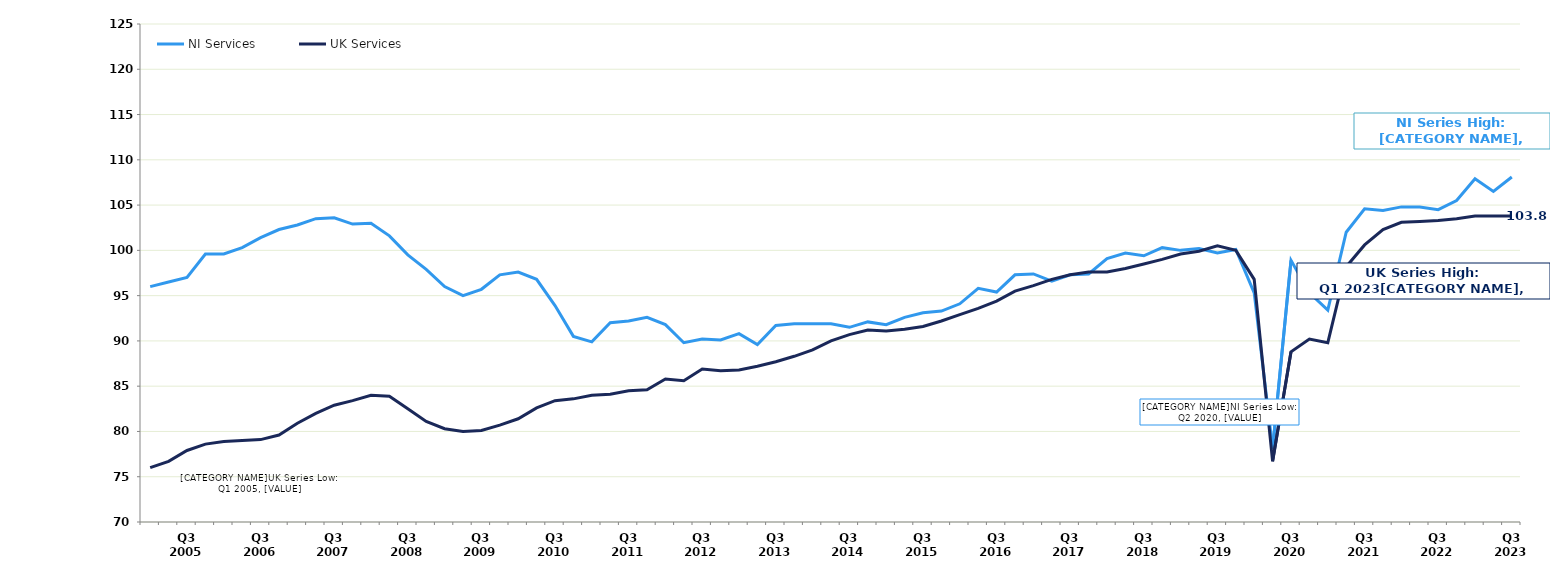
| Category | NI Services | UK Services |
|---|---|---|
|  | 96 | 76 |
|  | 96.5 | 76.7 |
| Q3 2005 | 97 | 77.9 |
|  | 99.6 | 78.6 |
|  | 99.6 | 78.9 |
|  | 100.3 | 79 |
| Q3 2006 | 101.4 | 79.1 |
|  | 102.3 | 79.6 |
|  | 102.8 | 80.9 |
|  | 103.5 | 82 |
| Q3 2007 | 103.6 | 82.9 |
|  | 102.9 | 83.4 |
|  | 103 | 84 |
|  | 101.6 | 83.9 |
| Q3 2008 | 99.5 | 82.5 |
|  | 97.9 | 81.1 |
|  | 96 | 80.3 |
|  | 95 | 80 |
| Q3 2009 | 95.7 | 80.1 |
|  | 97.3 | 80.7 |
|  | 97.6 | 81.4 |
|  | 96.8 | 82.6 |
| Q3 2010 | 93.9 | 83.4 |
|  | 90.5 | 83.6 |
|  | 89.9 | 84 |
|  | 92 | 84.1 |
| Q3 2011 | 92.2 | 84.5 |
|  | 92.6 | 84.6 |
|  | 91.8 | 85.8 |
|  | 89.8 | 85.6 |
| Q3 2012 | 90.2 | 86.9 |
|  | 90.1 | 86.7 |
|  | 90.8 | 86.8 |
|  | 89.6 | 87.2 |
| Q3 2013 | 91.7 | 87.7 |
|  | 91.9 | 88.3 |
|  | 91.9 | 89 |
|  | 91.9 | 90 |
| Q3 2014 | 91.5 | 90.7 |
|  | 92.1 | 91.2 |
|  | 91.8 | 91.1 |
|  | 92.6 | 91.3 |
| Q3 2015 | 93.1 | 91.6 |
|  | 93.3 | 92.2 |
|  | 94.1 | 92.9 |
|  | 95.8 | 93.6 |
| Q3 2016 | 95.4 | 94.4 |
|  | 97.3 | 95.5 |
|  | 97.4 | 96.1 |
|  | 96.6 | 96.8 |
| Q3 2017 | 97.3 | 97.3 |
|  | 97.4 | 97.6 |
|  | 99.1 | 97.6 |
|  | 99.7 | 98 |
| Q3 2018 | 99.4 | 98.5 |
|  | 100.3 | 99 |
|  | 100 | 99.6 |
|  | 100.2 | 99.9 |
| Q3 2019 | 99.7 | 100.5 |
|  | 100.1 | 100 |
|  | 95.3 | 96.8 |
|  | 78.1 | 76.7 |
| Q3 2020 | 98.9 | 88.8 |
|  | 95.3 | 90.2 |
|  | 93.4 | 89.8 |
|  | 102 | 98.2 |
| Q3 2021 | 104.6 | 100.6 |
|  | 104.4 | 102.3 |
|  | 104.8 | 103.1 |
|  | 104.8 | 103.2 |
| Q3 2022 | 104.5 | 103.3 |
|  | 105.5 | 103.5 |
|  | 107.9 | 103.8 |
|  | 106.5 | 103.8 |
| Q3 2023 | 108.1 | 103.8 |